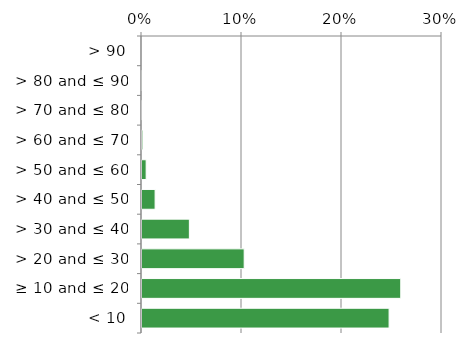
| Category | Native |
|---|---|
|  < 10 | 0.248 |
|  ≥ 10 and ≤ 20 | 0.26 |
|  > 20 and ≤ 30 | 0.103 |
|  > 30 and ≤ 40 | 0.048 |
|  > 40 and ≤ 50 | 0.014 |
|  > 50 and ≤ 60 | 0.005 |
|  > 60 and ≤ 70 | 0.002 |
|  > 70 and ≤ 80 | 0.001 |
|  > 80 and ≤ 90 | 0 |
|  > 90 | 0 |